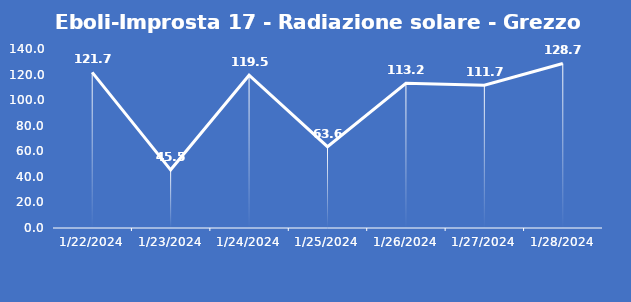
| Category | Eboli-Improsta 17 - Radiazione solare - Grezzo (W/m2) |
|---|---|
| 1/22/24 | 121.7 |
| 1/23/24 | 45.5 |
| 1/24/24 | 119.5 |
| 1/25/24 | 63.6 |
| 1/26/24 | 113.2 |
| 1/27/24 | 111.7 |
| 1/28/24 | 128.7 |